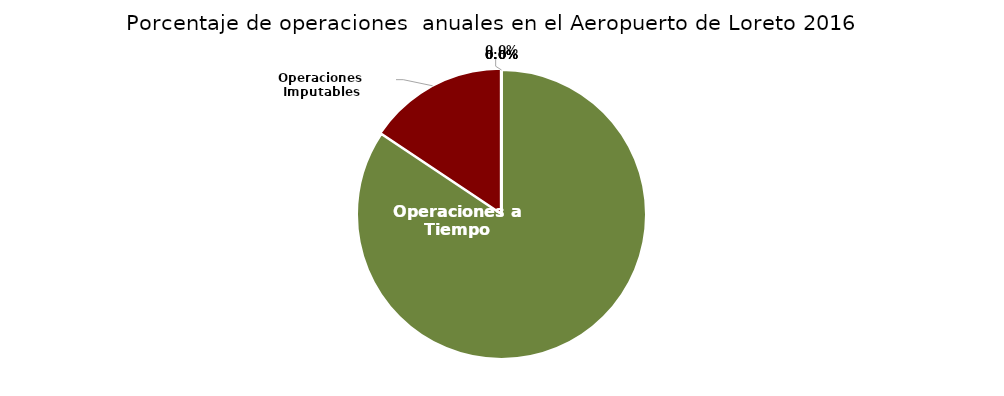
| Category | Series 0 |
|---|---|
| Operaciones a Tiempo | 572 |
| Operaciones Imputables | 106 |